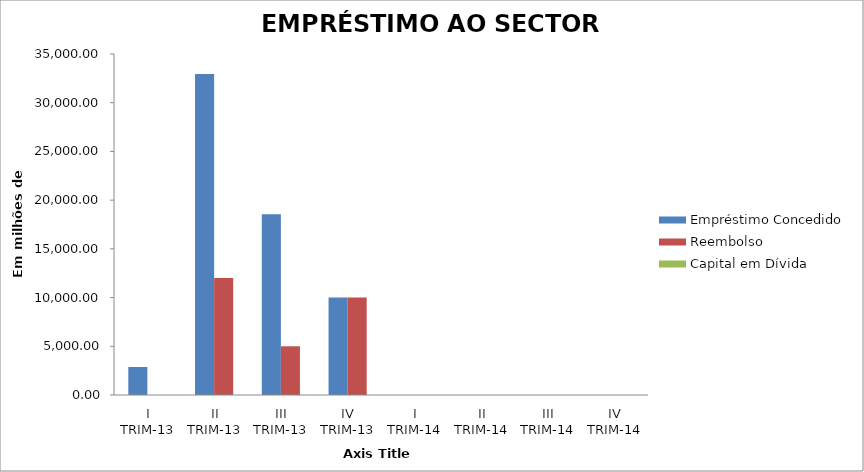
| Category | Empréstimo Concedido | Reembolso |
|---|---|---|
| I TRIM-13 | 2874.704 | 0 |
| II TRIM-13 | 32953.078 | 12000 |
| III TRIM-13 | 18561.506 | 5000 |
| IV TRIM-13 | 10000 | 10000 |
| I TRIM-14 | 0 | 0 |
| II TRIM-14 | 0 | 0 |
| III TRIM-14 | 0 | 0 |
| IV TRIM-14 | 0 | 0 |